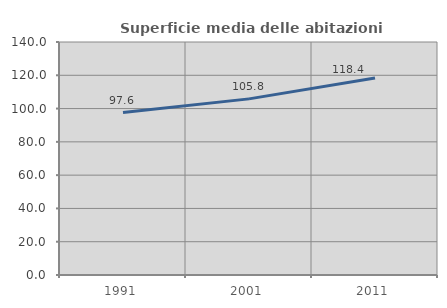
| Category | Superficie media delle abitazioni occupate |
|---|---|
| 1991.0 | 97.601 |
| 2001.0 | 105.825 |
| 2011.0 | 118.414 |